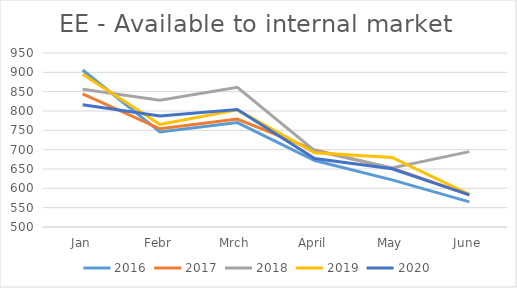
| Category | 2016 | 2017 | 2018 | 2019 | 2020 |
|---|---|---|---|---|---|
| Jan | 906 | 844 | 856 | 895 | 816.267 |
| Febr | 746 | 754 | 828 | 765 | 787.275 |
| Mrch | 770 | 779 | 861.2 | 803 | 803.89 |
| April | 672 | 699 | 697.5 | 691.8 | 676.979 |
| May | 622 | 652 | 652.543 | 679.879 | 650.645 |
| June | 565 | 583 | 695 | 584.366 | 583.068 |